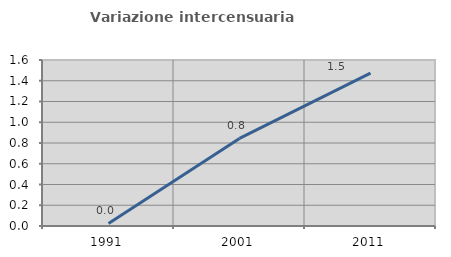
| Category | Variazione intercensuaria annua |
|---|---|
| 1991.0 | 0.025 |
| 2001.0 | 0.844 |
| 2011.0 | 1.473 |